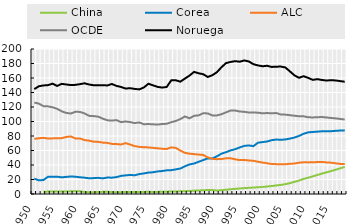
| Category | China | Corea | ALC | OCDE  | #REF! | Noruega |
|---|---|---|---|---|---|---|
| 0 |  |  |  |  | 1 |  |